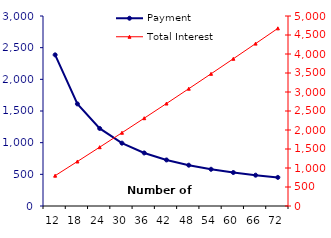
| Category | Payment |
|---|---|
| 12.0 | 2386.59 |
| 18.0 | 1611.8 |
| 24.0 | 1224.54 |
| 30.0 | 992.29 |
| 36.0 | 837.55 |
| 42.0 | 727.09 |
| 48.0 | 644.32 |
| 54.0 | 579.99 |
| 60.0 | 528.59 |
| 66.0 | 486.58 |
| 72.0 | 451.61 |